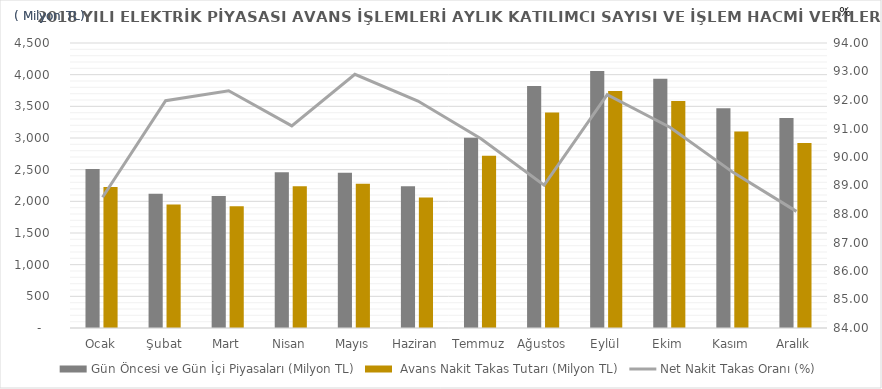
| Category | Gün Öncesi ve Gün İçi Piyasaları (Milyon TL) |  Avans Nakit Takas Tutarı (Milyon TL) |
|---|---|---|
| Ocak | 2512.069 | 2225.359 |
| Şubat | 2119 | 1949 |
| Mart | 2084 | 1924 |
| Nisan | 2458 | 2239 |
| Mayıs | 2451 | 2277 |
| Haziran | 2240 | 2060 |
| Temmuz | 3002 | 2721 |
| Ağustos | 3822 | 3402 |
| Eylül | 4059 | 3742 |
| Ekim | 3937 | 3584 |
| Kasım | 3470 | 3104 |
| Aralık | 3317 | 2922 |